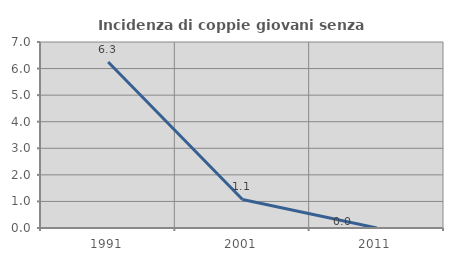
| Category | Incidenza di coppie giovani senza figli |
|---|---|
| 1991.0 | 6.25 |
| 2001.0 | 1.075 |
| 2011.0 | 0 |